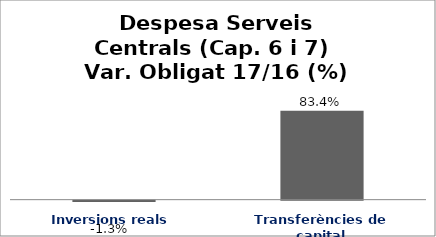
| Category | Series 0 |
|---|---|
| Inversions reals | -0.013 |
| Transferències de capital | 0.834 |